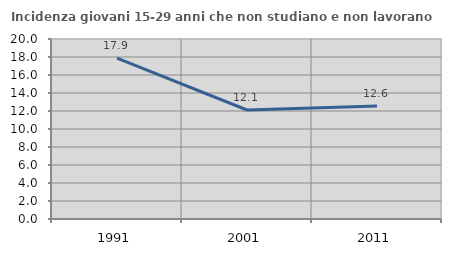
| Category | Incidenza giovani 15-29 anni che non studiano e non lavorano  |
|---|---|
| 1991.0 | 17.882 |
| 2001.0 | 12.111 |
| 2011.0 | 12.559 |